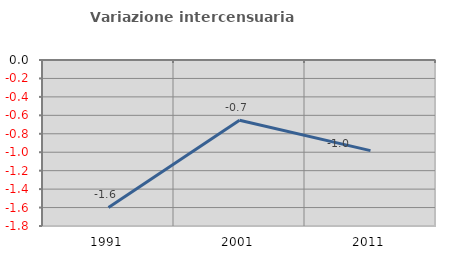
| Category | Variazione intercensuaria annua |
|---|---|
| 1991.0 | -1.599 |
| 2001.0 | -0.654 |
| 2011.0 | -0.983 |